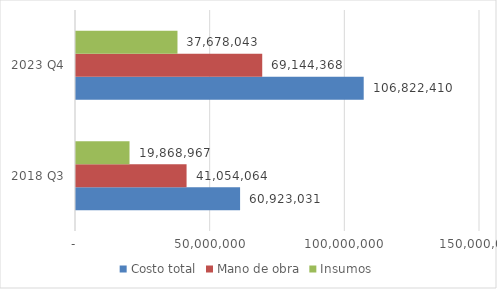
| Category | Costo total | Mano de obra | Insumos |
|---|---|---|---|
| 2018 Q3 | 60923031.371 | 41054064.171 | 19868967.2 |
| 2023 Q4 | 106822410.421 | 69144367.85 | 37678042.57 |